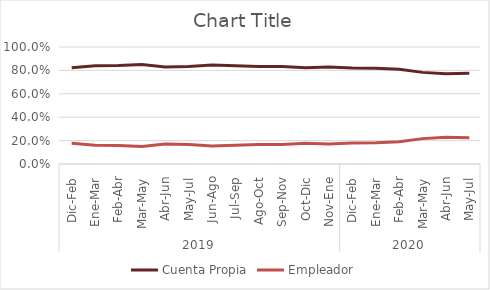
| Category | Cuenta Propia | Empleador |
|---|---|---|
| 0 | 0.822 | 0.178 |
| 1 | 0.839 | 0.161 |
| 2 | 0.842 | 0.158 |
| 3 | 0.851 | 0.149 |
| 4 | 0.829 | 0.171 |
| 5 | 0.832 | 0.168 |
| 6 | 0.845 | 0.155 |
| 7 | 0.839 | 0.161 |
| 8 | 0.833 | 0.167 |
| 9 | 0.834 | 0.166 |
| 10 | 0.823 | 0.177 |
| 11 | 0.828 | 0.172 |
| 12 | 0.82 | 0.18 |
| 13 | 0.819 | 0.181 |
| 14 | 0.81 | 0.19 |
| 15 | 0.783 | 0.217 |
| 16 | 0.771 | 0.229 |
| 17 | 0.775 | 0.225 |